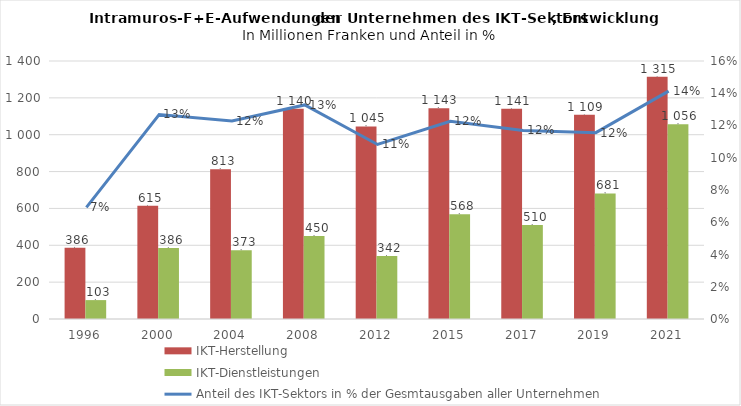
| Category | IKT-Herstellung  | IKT-Dienstleistungen |
|---|---|---|
| 1996.0 | 386.444 | 102.528 |
| 2000.0 | 614.859 | 385.786 |
| 2004.0 | 813.033 | 373.354 |
| 2008.0 | 1140.425 | 449.901 |
| 2012.0 | 1045.092 | 342.216 |
| 2015.0 | 1143.026 | 568.393 |
| 2017.0 | 1141.054 | 509.618 |
| 2019.0 | 1108.871 | 681.38 |
| 2021.0 | 1314.59 | 1056.47 |